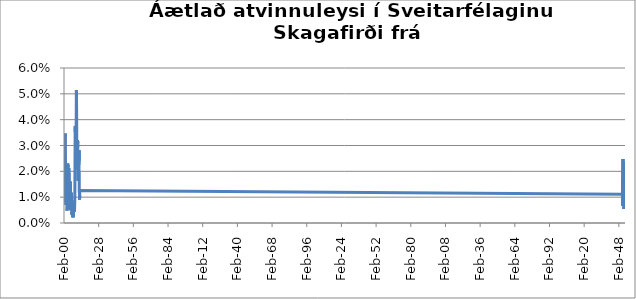
| Category | Series 0 |
|---|---|
| 2000-02-01 | 0.031 |
| 2000-03-01 | 0.03 |
| 2000-04-01 | 0.029 |
| 2000-05-01 | 0.023 |
| 2000-06-01 | 0.018 |
| 2000-07-01 | 0.017 |
| 2000-08-01 | 0.014 |
| 2000-09-01 | 0.009 |
| 2000-10-01 | 0.011 |
| 2000-11-01 | 0.024 |
| 2000-12-01 | 0.029 |
| 2001-01-01 | 0.035 |
| 2001-02-01 | 0.033 |
| 2001-03-01 | 0.028 |
| 2001-04-01 | 0.025 |
| 2001-05-01 | 0.016 |
| 2001-06-01 | 0.01 |
| 2001-07-01 | 0.012 |
| 2001-08-01 | 0.008 |
| 2001-09-01 | 0.007 |
| 2001-10-01 | 0.01 |
| 2001-11-01 | 0.013 |
| 2001-12-01 | 0.017 |
| 2002-01-01 | 0.016 |
| 2002-02-01 | 0.016 |
| 2002-03-01 | 0.018 |
| 2002-04-01 | 0.018 |
| 2002-05-01 | 0.014 |
| 2002-06-01 | 0.009 |
| 2002-07-01 | 0.005 |
| 2002-08-01 | 0.005 |
| 2002-09-01 | 0.006 |
| 2002-10-01 | 0.012 |
| 2002-11-01 | 0.015 |
| 2002-12-01 | 0.018 |
| 2003-01-01 | 0.022 |
| 2003-02-01 | 0.023 |
| 2003-03-01 | 0.022 |
| 2003-04-01 | 0.022 |
| 2003-05-01 | 0.016 |
| 2003-06-01 | 0.008 |
| 2003-07-01 | 0.007 |
| 2003-08-01 | 0.013 |
| 2003-09-01 | 0.014 |
| 2003-10-01 | 0.008 |
| 2003-11-01 | 0.011 |
| 2003-12-01 | 0.013 |
| 2004-01-01 | 0.021 |
| 2004-02-01 | 0.021 |
| 2004-03-01 | 0.02 |
| 2004-04-01 | 0.019 |
| 2004-05-01 | 0.017 |
| 2004-06-01 | 0.013 |
| 2004-07-01 | 0.012 |
| 2004-08-01 | 0.005 |
| 2004-09-01 | 0.006 |
| 2004-10-01 | 0.008 |
| 2004-11-01 | 0.009 |
| 2004-12-01 | 0.013 |
| 2005-01-01 | 0.016 |
| 2005-02-01 | 0.015 |
| 2005-03-01 | 0.012 |
| 2005-04-01 | 0.015 |
| 2005-05-01 | 0.013 |
| 2005-06-01 | 0.01 |
| 2005-07-01 | 0.008 |
| 2005-08-01 | 0.006 |
| 2005-09-01 | 0.005 |
| 2005-10-01 | 0.008 |
| 2005-11-01 | 0.012 |
| 2005-12-01 | 0.01 |
| 2006-01-01 | 0.011 |
| 2006-02-01 | 0.011 |
| 2006-03-01 | 0.01 |
| 2006-04-01 | 0.009 |
| 2006-05-01 | 0.006 |
| 2006-06-01 | 0.003 |
| 2006-07-01 | 0.004 |
| 2006-08-01 | 0.003 |
| 2006-09-01 | 0.003 |
| 2006-10-01 | 0.004 |
| 2006-11-01 | 0.004 |
| 2006-12-01 | 0.004 |
| 2007-01-01 | 0.004 |
| 2007-02-01 | 0.006 |
| 2007-03-01 | 0.004 |
| 2007-04-01 | 0.003 |
| 2007-05-01 | 0.006 |
| 2007-06-01 | 0.002 |
| 2007-07-01 | 0.004 |
| 2007-08-01 | 0.004 |
| 2007-09-01 | 0.005 |
| 2007-10-01 | 0.004 |
| 2007-11-01 | 0.006 |
| 2007-12-01 | 0.006 |
| 2008-01-01 | 0.008 |
| 2008-02-01 | 0.009 |
| 2008-03-01 | 0.008 |
| 2008-04-01 | 0.007 |
| 2008-05-01 | 0.007 |
| 2008-06-01 | 0.006 |
| 2008-07-01 | 0.004 |
| 2008-08-01 | 0.005 |
| 2008-09-01 | 0.006 |
| 2008-10-01 | 0.008 |
| 2008-11-01 | 0.011 |
| 2008-12-01 | 0.017 |
| 2009-01-01 | 0.026 |
| 2009-02-01 | 0.036 |
| 2009-03-01 | 0.037 |
| 2009-04-01 | 0.038 |
| 2009-05-01 | 0.029 |
| 2009-06-01 | 0.026 |
| 2009-07-01 | 0.024 |
| 2009-08-01 | 0.022 |
| 2009-09-01 | 0.021 |
| 2009-10-01 | 0.031 |
| 2009-11-01 | 0.036 |
| 2009-12-01 | 0.039 |
| 2010-01-01 | 0.044 |
| 2010-02-01 | 0.051 |
| 2010-03-01 | 0.048 |
| 2010-04-01 | 0.045 |
| 2010-05-01 | 0.038 |
| 2010-06-01 | 0.024 |
| 2010-07-01 | 0.024 |
| 2010-08-01 | 0.024 |
| 2010-09-01 | 0.026 |
| 2010-10-01 | 0.027 |
| 2010-11-01 | 0.031 |
| 2010-12-01 | 0.03 |
| 2011-01-01 | 0.032 |
| 2011-02-01 | 0.031 |
| 2011-03-01 | 0.032 |
| 2011-04-01 | 0.029 |
| 2011-05-01 | 0.022 |
| 2011-06-01 | 0.021 |
| 2011-07-01 | 0.016 |
| 2011-08-01 | 0.019 |
| 2011-09-01 | 0.019 |
| 2011-10-01 | 0.02 |
| 2011-11-01 | 0.023 |
| 2011-12-01 | 0.026 |
| 2012-01-01 | 0.024 |
| 2012-02-01 | 0.024 |
| 2012-03-01 | 0.028 |
| 2012-04-01 | 0.023 |
| 2012-05-01 | 0.018 |
| 2012-06-01 | 0.012 |
| 2012-07-01 | 0.012 |
| 2012-08-01 | 0.013 |
| 2012-09-01 | 0.009 |
| 2012-10-01 | 0.011 |
| 2012-11-01 | 0.013 |
| 2012-12-01 | 0.013 |
| 201301.0 | 0.011 |
| 201302.0 | 0.014 |
| 201303.0 | 0.016 |
| 201304.0 | 0.015 |
| 201305.0 | 0.012 |
| 201306.0 | 0.009 |
| 201307.0 | 0.008 |
| 201308.0 | 0.008 |
| 201309.0 | 0.007 |
| 201310.0 | 0.008 |
| 201311.0 | 0.007 |
| 201312.0 | 0.01 |
| 201401.0 | 0.018 |
| 201402.0 | 0.025 |
| 201403.0 | 0.022 |
| 201404.0 | 0.019 |
| 201405.0 | 0.015 |
| 201406.0 | 0.016 |
| 201407.0 | 0.017 |
| 201408.0 | 0.014 |
| 201409.0 | 0.017 |
| 201410.0 | 0.019 |
| 201411.0 | 0.02 |
| 201412.0 | 0.02 |
| 201501.0 | 0.022 |
| 201502.0 | 0.018 |
| 201503.0 | 0.017 |
| 201504.0 | 0.016 |
| 201505.0 | 0.014 |
| 201506.0 | 0.011 |
| 201507.0 | 0.012 |
| 201508.0 | 0.014 |
| 201509.0 | 0.014 |
| 201510.0 | 0.015 |
| 201511.0 | 0.015 |
| 201512.0 | 0.018 |
| 201601.0 | 0.018 |
| 201602.0 | 0.018 |
| 201603.0 | 0.016 |
| 201604.0 | 0.013 |
| 201605.0 | 0.01 |
| 201606.0 | 0.009 |
| 201607.0 | 0.013 |
| 201608.0 | 0.011 |
| 201609.0 | 0.009 |
| 201610.0 | 0.01 |
| 201611.0 | 0.015 |
| 201612.0 | 0.018 |
| 201701.0 | 0.024 |
| 201702.0 | 0.022 |
| 201703.0 | 0.018 |
| 201704.0 | 0.013 |
| 201705.0 | 0.011 |
| 201706.0 | 0.008 |
| 201707.0 | 0.006 |
| 201708.0 | 0.005 |
| 201709.0 | 0.007 |
| 201710.0 | 0.009 |
| 201711.0 | 0.009 |
| 201712.0 | 0.009 |
| 201801.0 | 0.014 |
| 201802.0 | 0.013 |
| 201803.0 | 0.011 |
| 201804.0 | 0.012 |
| 201805.0 | 0.008 |
| 201806.0 | 0.008 |
| 201807.0 | 0.009 |
| 201808.0 | 0.007 |
| 201809.0 | 0.011 |
| 201810.0 | 0.012 |
| 201811.0 | 0.011 |
| 201812.0 | 0.012 |
| 201901.0 | 0.011 |
| 201902.0 | 0.011 |
| 201903.0 | 0.01 |
| 201904.0 | 0.008 |
| 201905.0 | 0.009 |
| 201906.0 | 0.007 |
| 201907.0 | 0.007 |
| 201908.0 | 0.006 |
| 201909.0 | 0.005 |
| 201910.0 | 0.012 |
| 201911.0 | 0.014 |
| 201912.0 | 0.017 |
| 202001.0 | 0.019 |
| 202002.0 | 0.018 |